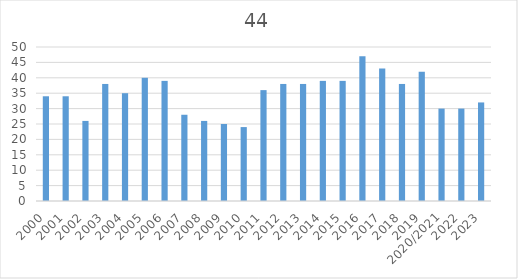
| Category | 44 |
|---|---|
| 2000 | 34 |
| 2001 | 34 |
| 2002 | 26 |
| 2003 | 38 |
| 2004 | 35 |
| 2005 | 40 |
| 2006 | 39 |
| 2007 | 28 |
| 2008 | 26 |
| 2009 | 25 |
| 2010 | 24 |
| 2011 | 36 |
| 2012 | 38 |
| 2013 | 38 |
| 2014 | 39 |
| 2015 | 39 |
| 2016 | 47 |
| 2017 | 43 |
| 2018 | 38 |
| 2019 | 42 |
| 2020/2021 | 30 |
| 2022 | 30 |
| 2023 | 32 |